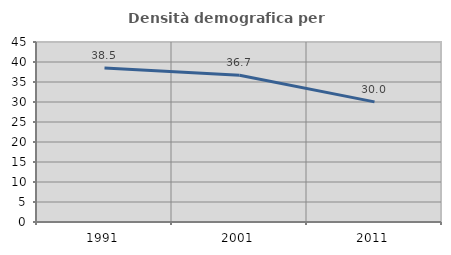
| Category | Densità demografica |
|---|---|
| 1991.0 | 38.528 |
| 2001.0 | 36.665 |
| 2011.0 | 30.026 |